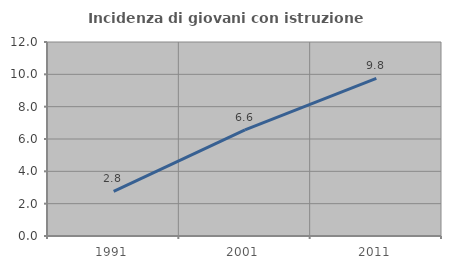
| Category | Incidenza di giovani con istruzione universitaria |
|---|---|
| 1991.0 | 2.759 |
| 2001.0 | 6.569 |
| 2011.0 | 9.756 |